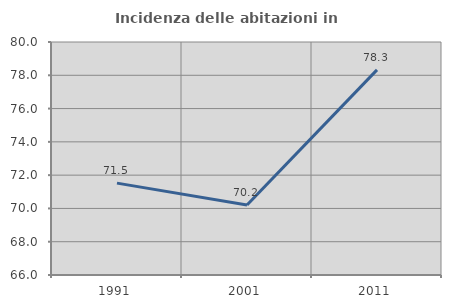
| Category | Incidenza delle abitazioni in proprietà  |
|---|---|
| 1991.0 | 71.519 |
| 2001.0 | 70.206 |
| 2011.0 | 78.324 |